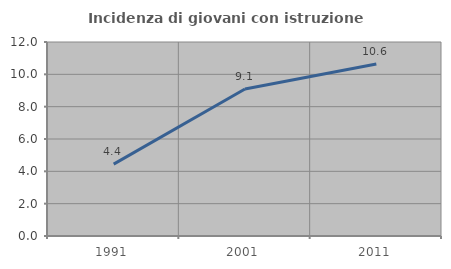
| Category | Incidenza di giovani con istruzione universitaria |
|---|---|
| 1991.0 | 4.444 |
| 2001.0 | 9.091 |
| 2011.0 | 10.638 |